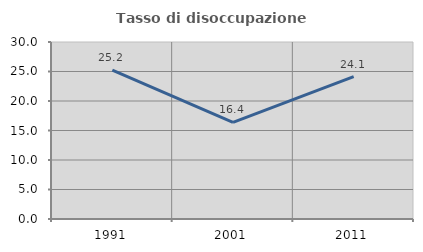
| Category | Tasso di disoccupazione giovanile  |
|---|---|
| 1991.0 | 25.243 |
| 2001.0 | 16.393 |
| 2011.0 | 24.138 |